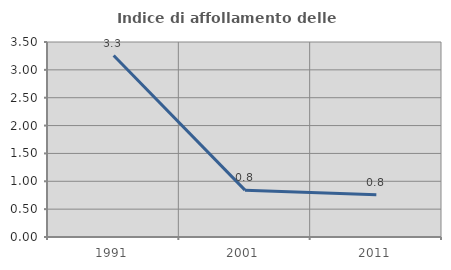
| Category | Indice di affollamento delle abitazioni  |
|---|---|
| 1991.0 | 3.257 |
| 2001.0 | 0.841 |
| 2011.0 | 0.758 |